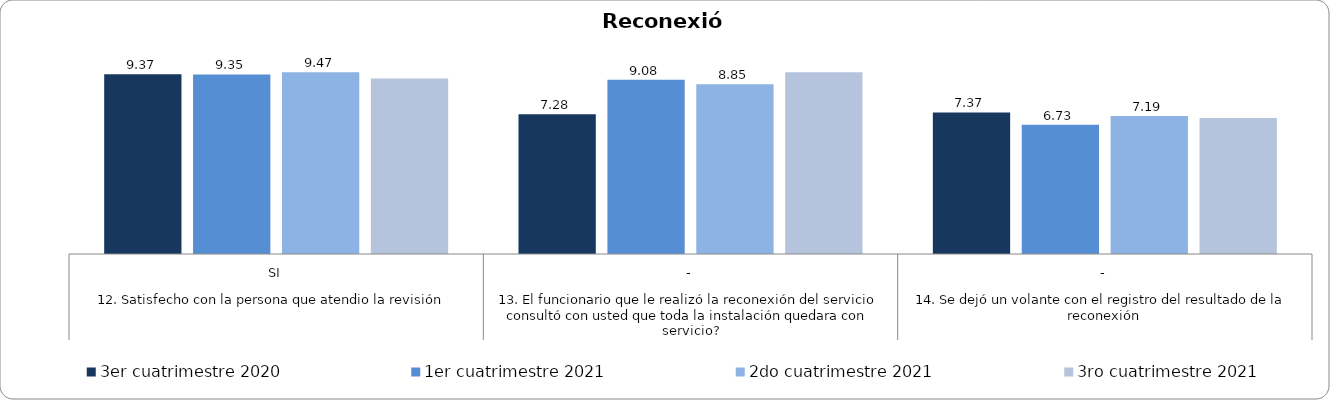
| Category | 3er cuatrimestre 2020 | 1er cuatrimestre 2021 | 2do cuatrimestre 2021 | 3ro cuatrimestre 2021 |
|---|---|---|---|---|
| 0 | 9.366 | 9.35 | 9.466 | 9.139 |
| 1 | 7.277 | 9.078 | 8.846 | 9.463 |
| 2 | 7.374 | 6.728 | 7.19 | 7.089 |